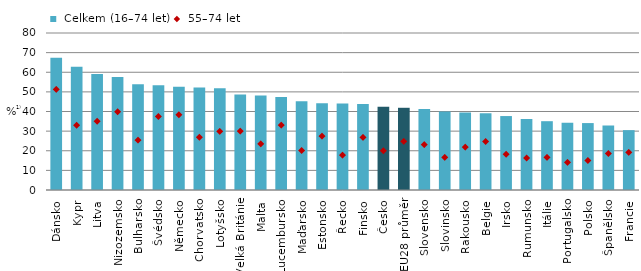
| Category |  Celkem (16–74 let) |
|---|---|
| Dánsko | 67.378 |
| Kypr | 62.846 |
| Litva | 59.157 |
| Nizozemsko | 57.52 |
| Bulharsko | 53.9 |
| Švédsko | 53.369 |
| Německo | 52.549 |
| Chorvatsko | 52.19 |
| Lotyšsko | 51.902 |
| Velká Británie | 48.645 |
| Malta | 48.196 |
| Lucembursko | 47.334 |
| Maďarsko | 45.268 |
| Estonsko | 44.184 |
| Řecko | 44.125 |
| Finsko | 43.77 |
| Česko | 42.478 |
| EU28 průměr | 41.895 |
| Slovensko | 41.229 |
| Slovinsko | 40.008 |
| Rakousko | 39.472 |
| Belgie | 39.046 |
| Irsko | 37.681 |
| Rumunsko | 36.147 |
| Itálie | 35.062 |
| Portugalsko | 34.224 |
| Polsko | 34.101 |
| Španělsko | 32.85 |
| Francie | 30.501 |